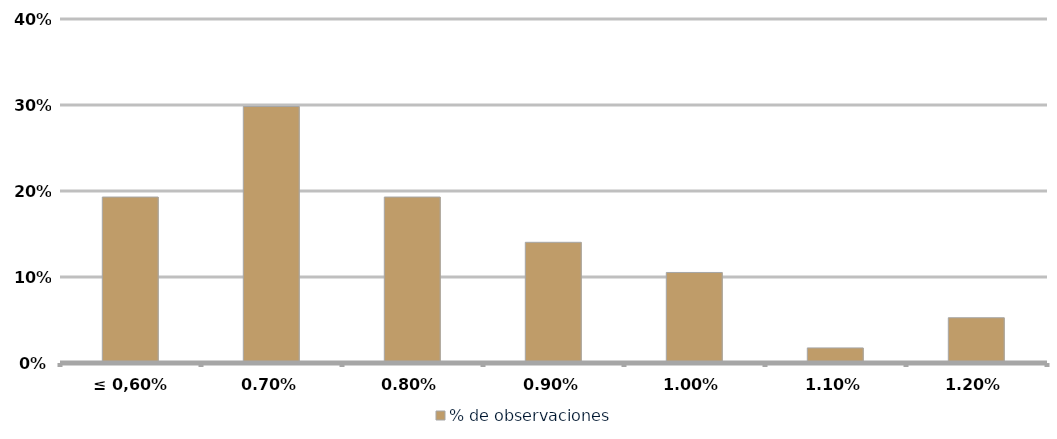
| Category | % de observaciones  |
|---|---|
| ≤ 0,60% | 0.193 |
| 0,70% | 0.298 |
| 0,80% | 0.193 |
| 0,90% | 0.14 |
| 1,00% | 0.105 |
| 1,10% | 0.018 |
| 1,20% | 0.053 |